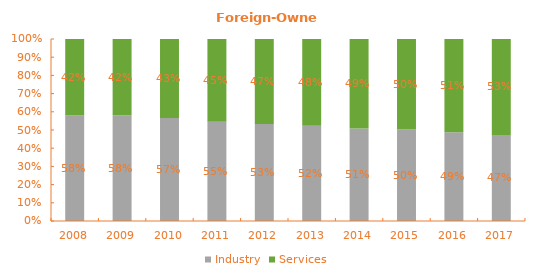
| Category | Industry | Services |
|---|---|---|
| 2008.0 | 0.58 | 0.42 |
| 2009.0 | 0.582 | 0.418 |
| 2010.0 | 0.566 | 0.434 |
| 2011.0 | 0.546 | 0.454 |
| 2012.0 | 0.533 | 0.467 |
| 2013.0 | 0.524 | 0.476 |
| 2014.0 | 0.509 | 0.491 |
| 2015.0 | 0.502 | 0.498 |
| 2016.0 | 0.487 | 0.513 |
| 2017.0 | 0.473 | 0.527 |